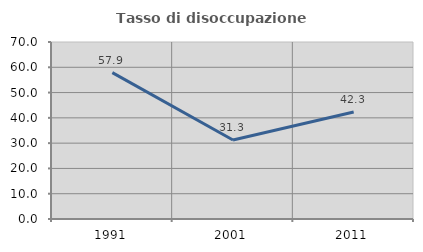
| Category | Tasso di disoccupazione giovanile  |
|---|---|
| 1991.0 | 57.895 |
| 2001.0 | 31.25 |
| 2011.0 | 42.308 |